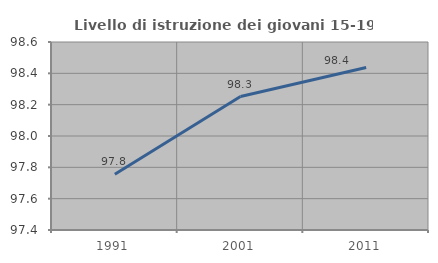
| Category | Livello di istruzione dei giovani 15-19 anni |
|---|---|
| 1991.0 | 97.756 |
| 2001.0 | 98.252 |
| 2011.0 | 98.438 |